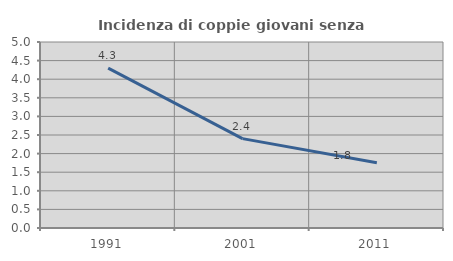
| Category | Incidenza di coppie giovani senza figli |
|---|---|
| 1991.0 | 4.296 |
| 2001.0 | 2.402 |
| 2011.0 | 1.754 |